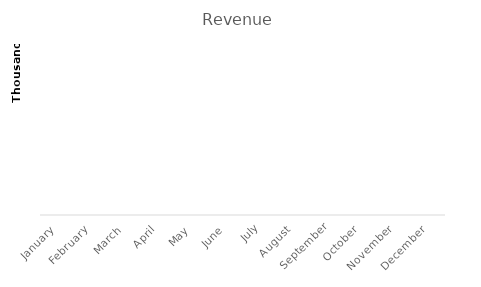
| Category | Revenue |
|---|---|
| January | 0 |
| February | 0 |
| March | 0 |
| April | 0 |
| May | 0 |
| June | 0 |
| July | 0 |
| August | 0 |
| September | 0 |
| October | 0 |
| November | 0 |
| December | 0 |